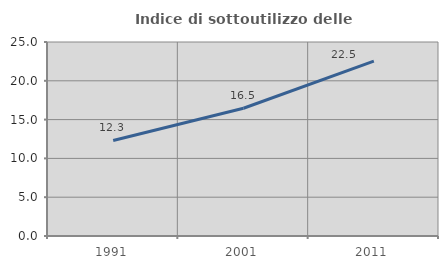
| Category | Indice di sottoutilizzo delle abitazioni  |
|---|---|
| 1991.0 | 12.311 |
| 2001.0 | 16.461 |
| 2011.0 | 22.527 |